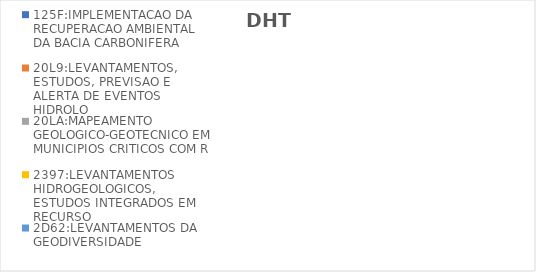
| Category | 125F:IMPLEMENTACAO DA RECUPERACAO AMBIENTAL DA BACIA CARBONIFERA | 20L9:LEVANTAMENTOS, ESTUDOS, PREVISAO E ALERTA DE EVENTOS HIDROLO | 20LA:MAPEAMENTO GEOLOGICO-GEOTECNICO EM MUNICIPIOS CRITICOS COM R | 2397:LEVANTAMENTOS HIDROGEOLOGICOS, ESTUDOS INTEGRADOS EM RECURSO | 2D62:LEVANTAMENTOS DA GEODIVERSIDADE |
|---|---|---|---|---|---|
| EXECUTADO | 0.045 | 0.185 | 0.186 | 0.163 | 0.381 |